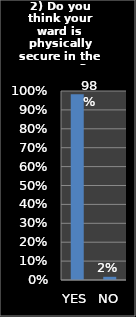
| Category | Series 0 |
|---|---|
| YES | 0.983 |
| NO | 0.017 |